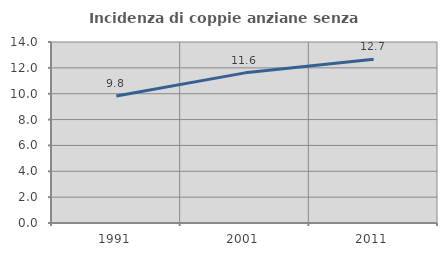
| Category | Incidenza di coppie anziane senza figli  |
|---|---|
| 1991.0 | 9.83 |
| 2001.0 | 11.613 |
| 2011.0 | 12.664 |